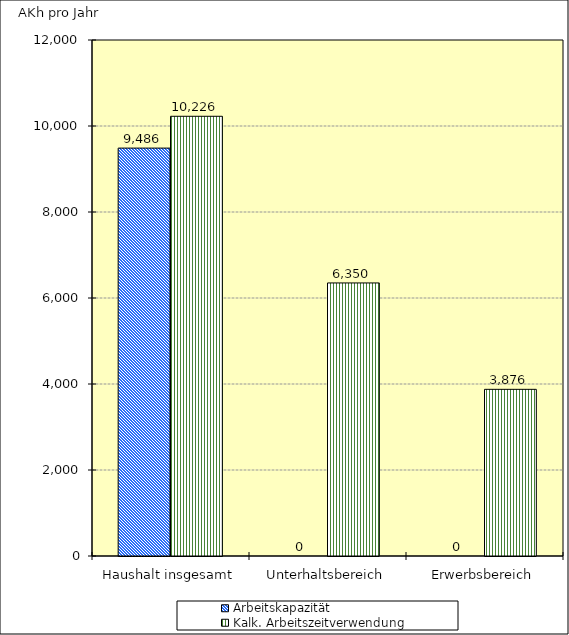
| Category | Arbeitskapazität | Kalk. Arbeitszeitverwendung |
|---|---|---|
| Haushalt insgesamt | 9486 | 10226 |
| Unterhaltsbereich | 0 | 6350 |
| Erwerbsbereich | 0 | 3876 |